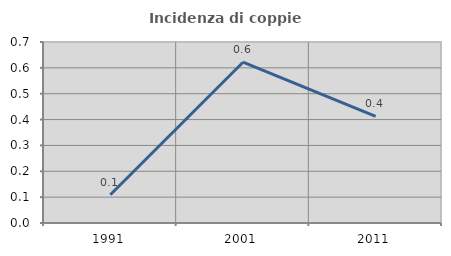
| Category | Incidenza di coppie miste |
|---|---|
| 1991.0 | 0.109 |
| 2001.0 | 0.622 |
| 2011.0 | 0.412 |